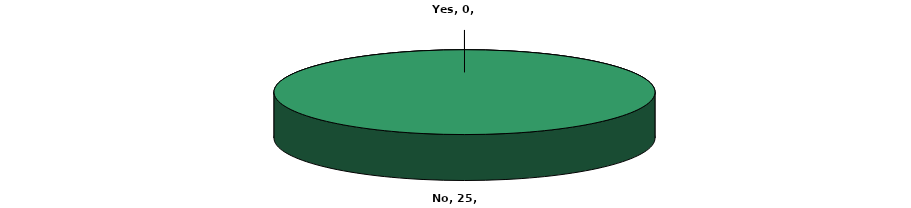
| Category | Series 0 |
|---|---|
| Yes | 0 |
| No | 25 |